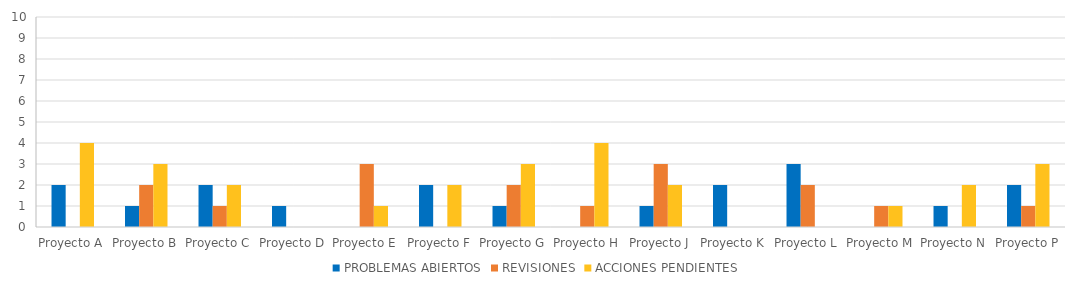
| Category | PROBLEMAS ABIERTOS | REVISIONES | ACCIONES PENDIENTES |
|---|---|---|---|
| Proyecto A | 2 | 0 | 4 |
| Proyecto B | 1 | 2 | 3 |
| Proyecto C | 2 | 1 | 2 |
| Proyecto D | 1 | 0 | 0 |
| Proyecto E | 0 | 3 | 1 |
| Proyecto F | 2 | 0 | 2 |
| Proyecto G | 1 | 2 | 3 |
| Proyecto H | 0 | 1 | 4 |
| Proyecto J | 1 | 3 | 2 |
| Proyecto K | 2 | 0 | 0 |
| Proyecto L | 3 | 2 | 0 |
| Proyecto M | 0 | 1 | 1 |
| Proyecto N | 1 | 0 | 2 |
| Proyecto P | 2 | 1 | 3 |